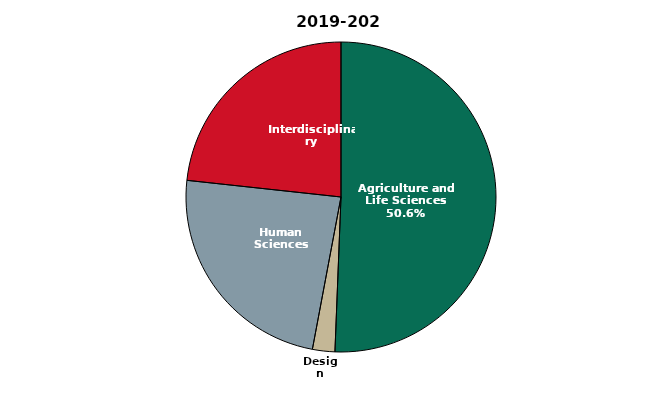
| Category | 2019-2020 |
|---|---|
| Agriculture and Life Sciences | 212831 |
| Design | 9810 |
| Human Sciences | 99893 |
| Interdisciplinary | 97888 |